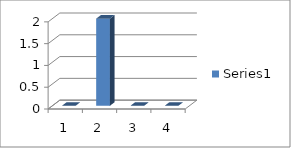
| Category | Series 0 |
|---|---|
| 0 | 0 |
| 1 | 2 |
| 2 | 0 |
| 3 | 0 |